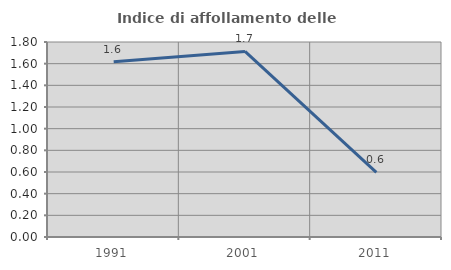
| Category | Indice di affollamento delle abitazioni  |
|---|---|
| 1991.0 | 1.617 |
| 2001.0 | 1.713 |
| 2011.0 | 0.596 |